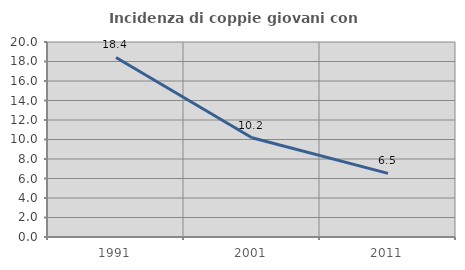
| Category | Incidenza di coppie giovani con figli |
|---|---|
| 1991.0 | 18.415 |
| 2001.0 | 10.18 |
| 2011.0 | 6.527 |